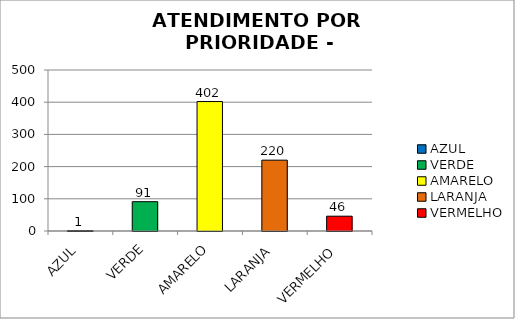
| Category | Total Regional: |
|---|---|
| AZUL | 1 |
| VERDE | 91 |
| AMARELO | 402 |
| LARANJA | 220 |
| VERMELHO | 46 |